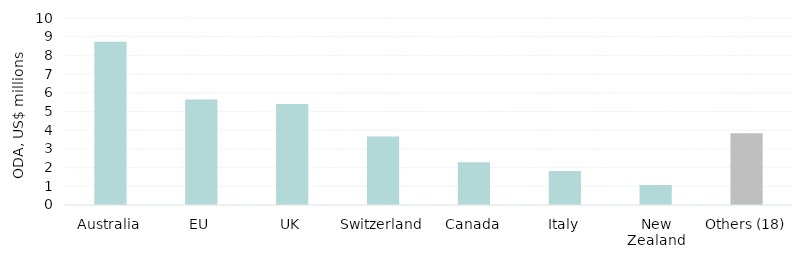
| Category | Diet-related NCD ODA disbursements, US$ millions, 2016 prices |
|---|---|
| Australia | 8.736 |
| EU | 5.636 |
| UK | 5.406 |
| Switzerland | 3.66 |
| Canada | 2.286 |
| Italy | 1.825 |
| New Zealand | 1.073 |
| Others (18) | 3.833 |